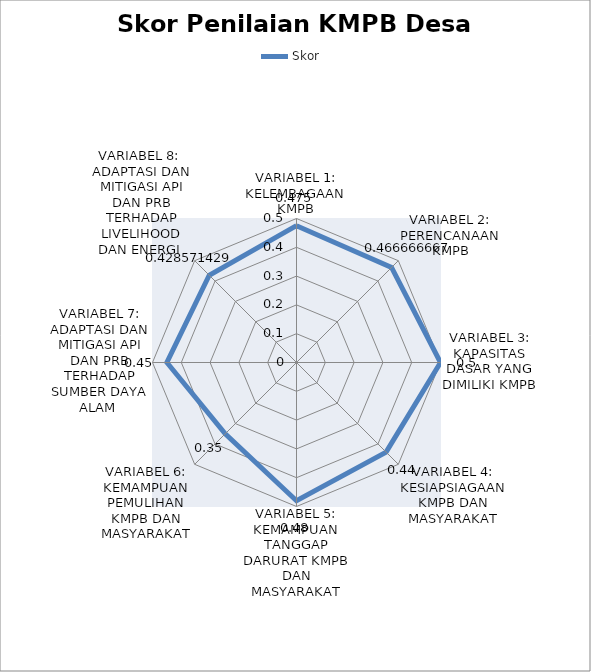
| Category | Skor  |
|---|---|
| VARIABEL 1: KELEMBAGAAN KMPB | 0.475 |
| VARIABEL 2: PERENCANAAN KMPB | 0.467 |
| VARIABEL 3: KAPASITAS DASAR YANG DIMILIKI KMPB | 0.5 |
| VARIABEL 4: KESIAPSIAGAAN KMPB DAN MASYARAKAT | 0.44 |
| VARIABEL 5: KEMAMPUAN TANGGAP DARURAT KMPB DAN MASYARAKAT | 0.48 |
| VARIABEL 6: KEMAMPUAN PEMULIHAN KMPB DAN MASYARAKAT | 0.35 |
| VARIABEL 7: ADAPTASI DAN MITIGASI API DAN PRB TERHADAP SUMBER DAYA ALAM  | 0.45 |
| VARIABEL 8:  ADAPTASI DAN MITIGASI API DAN PRB TERHADAP LIVELIHOOD DAN ENERGI  | 0.429 |